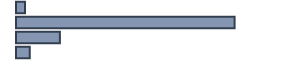
| Category | Series 0 |
|---|---|
| 0 | 3.2 |
| 1 | 76.7 |
| 2 | 15.4 |
| 3 | 4.8 |